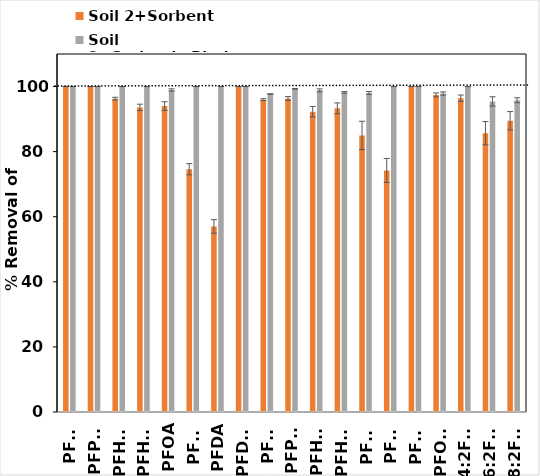
| Category | Soil 2+Sorbent | Soil 2+Sorbent+Binder |
|---|---|---|
| PFBA | 100 | 100 |
| PFPeA | 100 | 100 |
| PFHxA | 96.287 | 100 |
| PFHpA | 93.594 | 100 |
| PFOA | 93.996 | 98.964 |
| PFNA | 74.598 | 100 |
| PFDA | 57.015 | 100 |
| PFDoA | 100 | 100 |
| PFBS | 95.978 | 97.721 |
| PFPeS | 96.317 | 99.309 |
| PFHxS | 92.275 | 98.828 |
| PFHpS | 93.307 | 98.201 |
| PFOS | 84.984 | 98.035 |
| PFNS | 74.211 | 100 |
| PFDS | 100 | 100 |
| PFOSA | 97.427 | 97.859 |
| 4:2FTS | 96.417 | 100 |
| 6:2FTS | 85.674 | 95.429 |
| 8:2FTS | 89.495 | 95.792 |